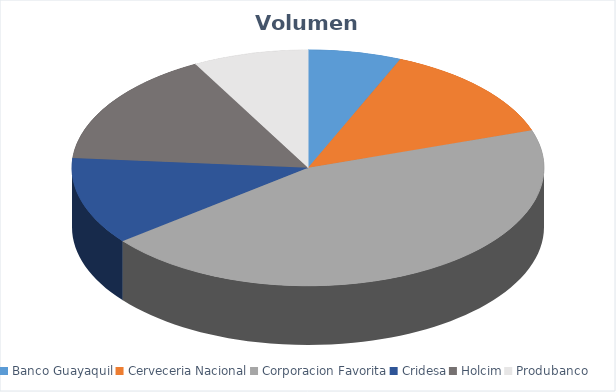
| Category | VOLUMEN ($USD) |
|---|---|
| Banco Guayaquil | 2421.65 |
| Cerveceria Nacional | 5100 |
| Corporacion Favorita | 16895.03 |
| Cridesa | 4550 |
| Holcim | 5974 |
| Produbanco | 3000 |